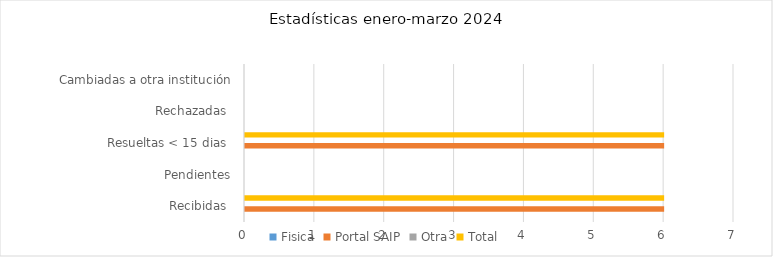
| Category | Fisica | Portal SAIP | Otra | Total |
|---|---|---|---|---|
| Recibidas  | 0 | 6 | 0 | 6 |
| Pendientes | 0 | 0 | 0 | 0 |
| Resueltas < 15 dias  | 0 | 6 | 0 | 6 |
| Rechazadas  | 0 | 0 | 0 | 0 |
| Cambiadas a otra institución | 0 | 0 | 0 | 0 |